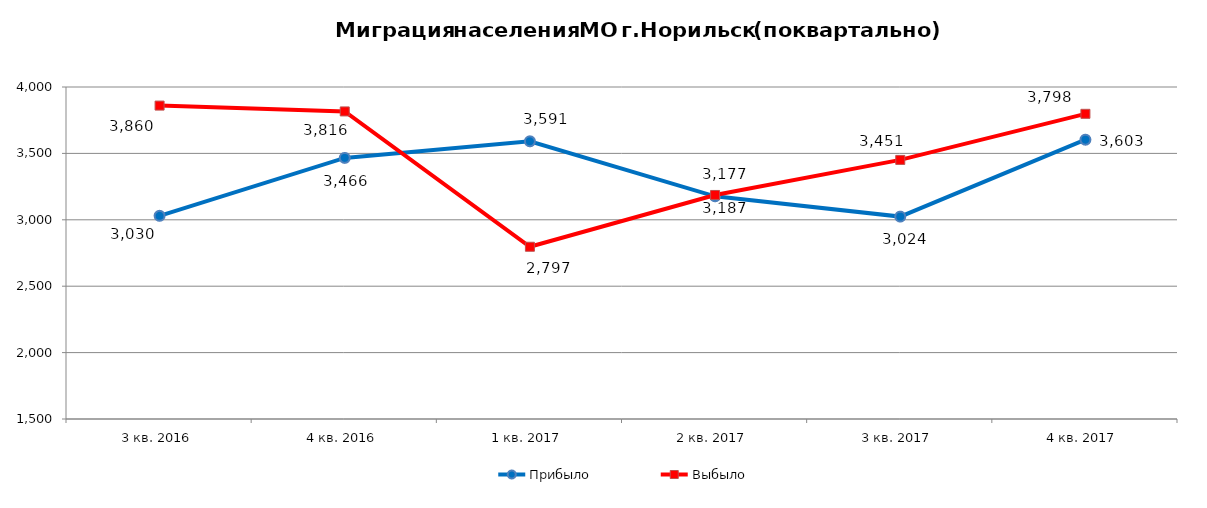
| Category | Прибыло | Выбыло |
|---|---|---|
| 3 кв. 2016 | 3030 | 3860 |
| 4 кв. 2016 | 3466 | 3816 |
| 1 кв. 2017 | 3591 | 2797 |
| 2 кв. 2017 | 3177 | 3187 |
| 3 кв. 2017 | 3024 | 3451 |
| 4 кв. 2017 | 3603 | 3798 |